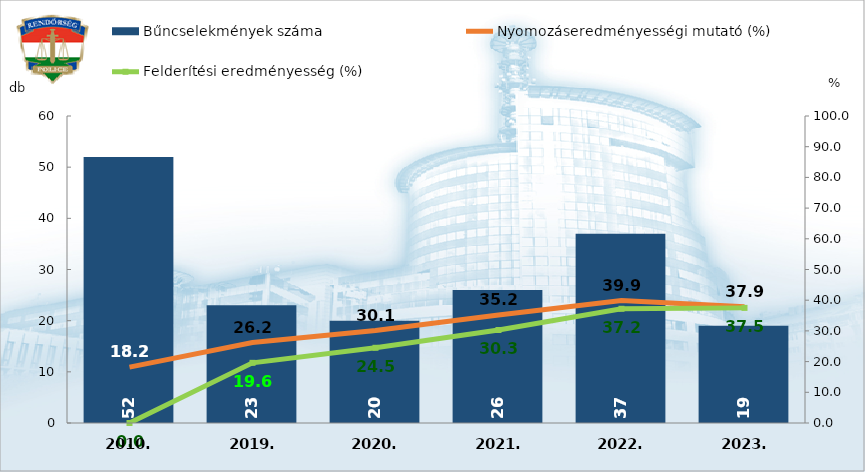
| Category | Bűncselekmények száma |
|---|---|
| 2010. | 52 |
| 2019. | 23 |
| 2020. | 20 |
| 2021. | 26 |
| 2022. | 37 |
| 2023. | 19 |